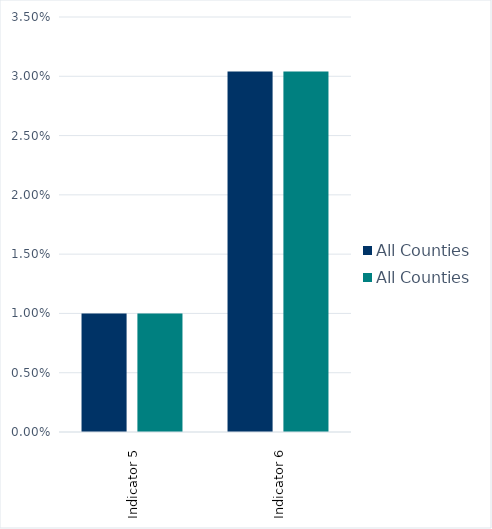
| Category | All Counties |
|---|---|
| Indicator 5 | 0.01 |
| Indicator 6 | 0.03 |